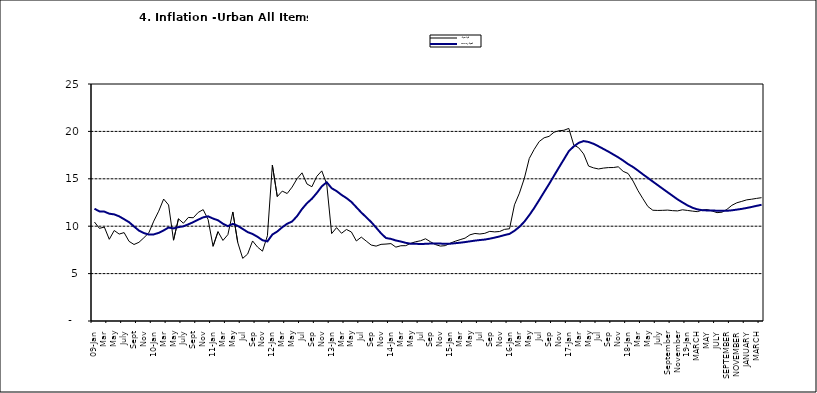
| Category | Year-on Rate | 12-Month Average |
|---|---|---|
| 09-Jan | 10.439 | 11.844 |
| Feb | 9.772 | 11.562 |
| Mar | 9.907 | 11.538 |
| Apr | 8.618 | 11.319 |
| May | 9.547 | 11.246 |
| June | 9.17 | 11.039 |
| July | 9.325 | 10.738 |
| Aug | 8.401 | 10.424 |
| Sept | 8.07 | 9.973 |
| Oct | 8.3 | 9.535 |
| Nov | 8.781 | 9.278 |
| Dec | 9.298 | 9.117 |
| 10-Jan | 10.534 | 9.136 |
| Feb | 11.584 | 9.297 |
| Mar | 12.864 | 9.555 |
| Apr | 12.24 | 9.859 |
| May | 8.524 | 9.769 |
| June | 10.781 | 9.904 |
| July | 10.313 | 9.987 |
| Aug | 10.924 | 10.197 |
| Sept | 10.891 | 10.43 |
| Oct | 11.457 | 10.689 |
| Nov | 11.748 | 10.932 |
| Dec | 10.699 | 11.042 |
| 11-Jan | 7.878 | 10.806 |
| Feb | 9.426 | 10.623 |
| Mar | 8.498 | 10.26 |
| Apr | 9.11 | 10.005 |
| May | 11.5 | 10.249 |
| Jun | 8.278 | 10.034 |
| Jul | 6.608 | 9.711 |
| Aug | 7.061 | 9.38 |
| Sep | 8.443 | 9.178 |
| Oct | 7.802 | 8.88 |
| Nov | 7.365 | 8.525 |
| Dec | 8.993 | 8.395 |
| 12-Jan | 16.445 | 9.119 |
| Feb | 13.123 | 9.443 |
| Mar | 13.701 | 9.889 |
| Apr | 13.447 | 10.259 |
| May | 14.127 | 10.496 |
| Jun | 15.012 | 11.062 |
| Jul | 15.63 | 11.81 |
| Aug | 14.456 | 12.422 |
| Sep | 14.162 | 12.893 |
| Oct | 15.26 | 13.506 |
| Nov | 15.836 | 14.199 |
| Dec | 14.459 | 14.637 |
| 13-Jan | 9.22 | 14.006 |
| Feb | 9.85 | 13.703 |
| Mar | 9.253 | 13.302 |
| Apr | 9.657 | 12.966 |
| May | 9.385 | 12.557 |
| Jun | 8.441 | 11.999 |
| Jul | 8.849 | 11.443 |
| Aug | 8.431 | 10.946 |
| Sep | 8.013 | 10.44 |
| Oct | 7.9 | 9.849 |
| Nov | 8.086 | 9.245 |
| Dec | 8.117 | 8.75 |
| 14-Jan | 8.164 | 8.662 |
| Feb | 7.791 | 8.493 |
| Mar | 7.937 | 8.384 |
| Apr | 7.947 | 8.246 |
| May | 8.195 | 8.151 |
| Jun | 8.358 | 8.146 |
| Jul | 8.464 | 8.118 |
| Aug | 8.673 | 8.141 |
| Sep | 8.357 | 8.17 |
| Oct | 8.064 | 8.182 |
| Nov | 7.902 | 8.165 |
| Dec | 7.948 | 8.151 |
| 15-Jan | 8.211 | 8.155 |
| Feb | 8.412 | 8.206 |
| Mar | 8.579 | 8.26 |
| Apr | 8.742 | 8.326 |
| May | 9.092 | 8.403 |
| Jun | 9.232 | 8.478 |
| Jul | 9.177 | 8.54 |
| Aug | 9.25 | 8.591 |
| Sep | 9.455 | 8.684 |
| Oct | 9.398 | 8.795 |
| Nov | 9.442 | 8.922 |
| Dec | 9.665 | 9.064 |
| 16-Jan | 9.728 | 9.19 |
| Feb | 12.254 | 9.516 |
| Mar | 13.485 | 9.935 |
| Apr | 15.052 | 10.474 |
| May | 17.148 | 11.165 |
| Jun | 18.111 | 11.925 |
| Jul | 18.927 | 12.754 |
| Aug | 19.325 | 13.605 |
| Sep | 19.476 | 14.444 |
| Oct | 19.914 | 15.318 |
| Nov | 20.067 | 16.193 |
| Dec | 20.118 | 17.05 |
| 17-Jan | 20.315 | 17.914 |
| Feb | 18.569 | 18.418 |
| Mar | 18.27 | 18.794 |
| Apr | 17.621 | 18.982 |
| May | 16.343 | 18.883 |
| Jun | 16.153 | 18.692 |
| Jul | 16.038 | 18.43 |
| Aug | 16.128 | 18.151 |
| Sep | 16.183 | 17.872 |
| Oct | 16.187 | 17.567 |
| Nov | 16.267 | 17.264 |
| Dec | 15.785 | 16.921 |
| 18-Jan | 15.559 | 16.55 |
| Feb | 14.763 | 16.241 |
| Mar | 13.748 | 15.866 |
| Apr | 12.893 | 15.468 |
| May | 12.077 | 15.096 |
| June | 11.683 | 14.706 |
| July | 11.661 | 14.329 |
| August | 11.673 | 13.951 |
| September | 11.697 | 13.578 |
| October | 11.64 | 13.206 |
| November | 11.615 | 12.831 |
| December | 11.731 | 12.509 |
| 19-Jan | 11.664 | 12.203 |
| February | 11.592 | 11.954 |
| MARCH | 11.535 | 11.78 |
| APRIL | 11.696 | 11.686 |
| MAY | 11.756 | 11.662 |
| JUNE | 11.605 | 11.655 |
| JULY | 11.432 | 11.635 |
| AUGUST | 11.479 | 11.618 |
| SEPTEMBER | 11.776 | 11.626 |
| OCTOBER | 12.202 | 11.676 |
| NOVEMBER | 12.469 | 11.75 |
| DECEMBER | 12.617 | 11.827 |
| JANUARY | 12.779 | 11.923 |
| FEBRUARY | 12.847 | 12.03 |
| MARCH | 12.932 | 12.147 |
| APRIL | 13.008 | 12.258 |